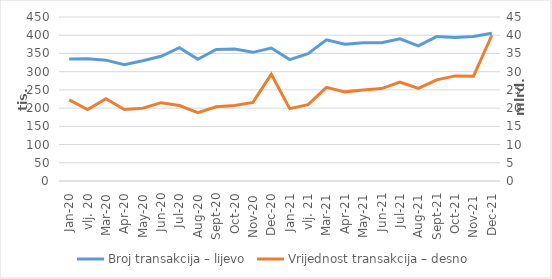
| Category | Broj transakcija – lijevo |
|---|---|
| sij.20 | 334778 |
| vlj. 20 | 335533 |
| ožu.20 | 331555 |
| tra.20 | 319128 |
| svi.20 | 329820 |
| lip.20 | 342182 |
| srp.20 | 365587 |
| kol.20 | 333814 |
| ruj.20 | 360919 |
| lis.20 | 362038 |
| stu.20 | 353021 |
| pro.20 | 364975 |
| sij.21 | 333014 |
| vlj. 21 | 349354 |
| ožu.21 | 387439 |
| tra.21 | 375411 |
| svi.21 | 379631 |
| lip.21 | 379107 |
| srp.21 | 390007 |
| kol.21 | 370722 |
| ruj.21 | 396218 |
| lis.21 | 393681 |
| stu.21 | 396476 |
| pro.21 | 405496 |